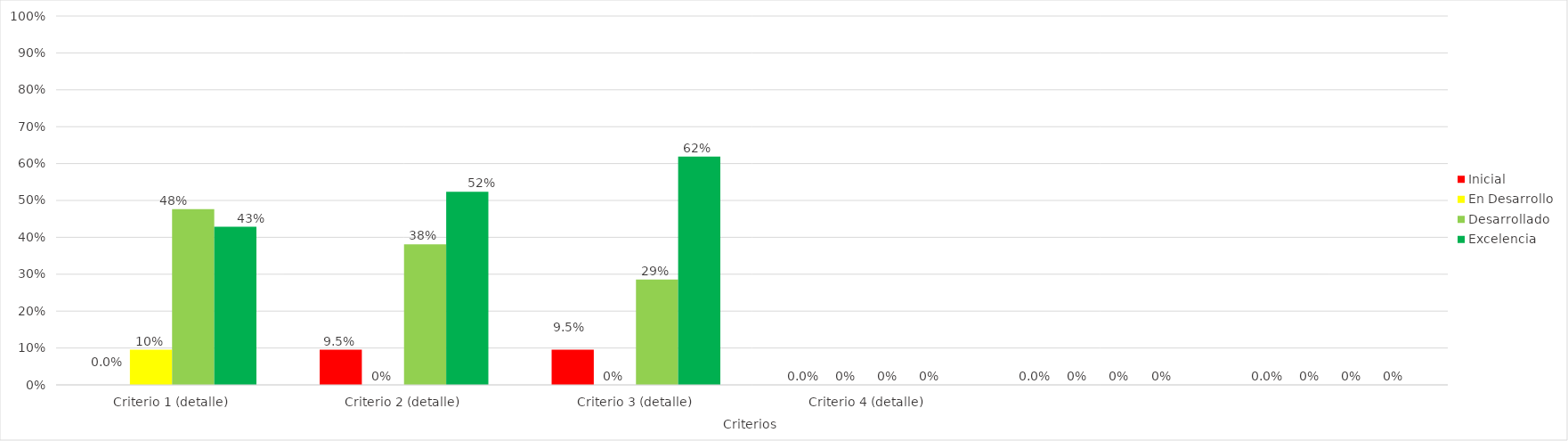
| Category | Inicial | En Desarrollo | Desarrollado | Excelencia |
|---|---|---|---|---|
| Criterio 1 (detalle) | 0 | 0.095 | 0.476 | 0.429 |
| Criterio 2 (detalle) | 0.095 | 0 | 0.381 | 0.524 |
| Criterio 3 (detalle) | 0.095 | 0 | 0.286 | 0.619 |
| Criterio 4 (detalle) | 0 | 0 | 0 | 0 |